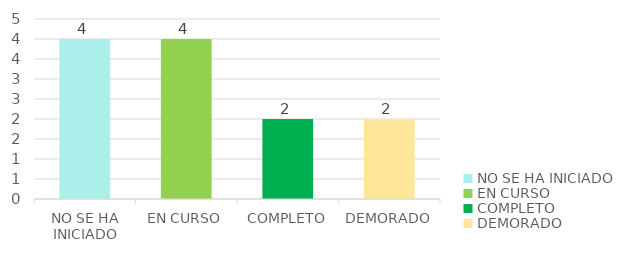
| Category | Series 0 |
|---|---|
| NO SE HA INICIADO | 4 |
| EN CURSO | 4 |
| COMPLETO | 2 |
| DEMORADO | 2 |